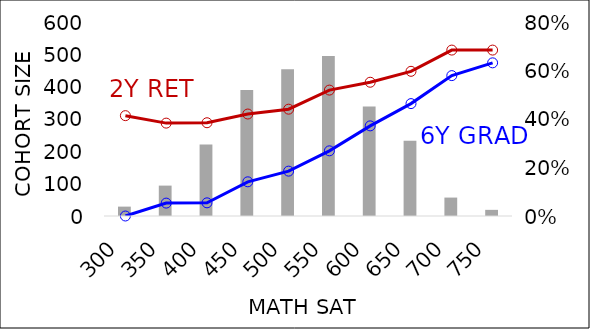
| Category | 10. Cohort Count |
|---|---|
| 300.0 | 29 |
| 350.0 | 94 |
| 400.0 | 221 |
| 450.0 | 390 |
| 500.0 | 454 |
| 550.0 | 495 |
| 600.0 | 339 |
| 650.0 | 233 |
| 700.0 | 57 |
| 750.0 | 19 |